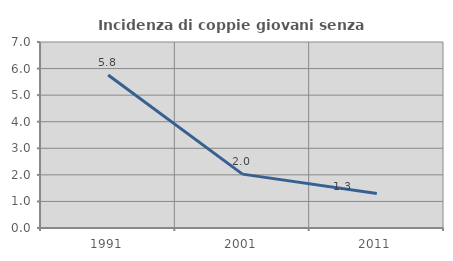
| Category | Incidenza di coppie giovani senza figli |
|---|---|
| 1991.0 | 5.755 |
| 2001.0 | 2.027 |
| 2011.0 | 1.299 |